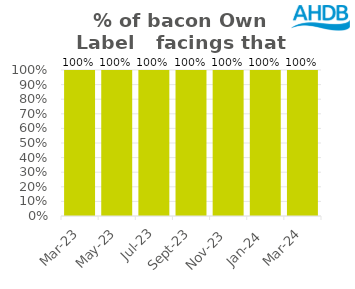
| Category | Bacon |
|---|---|
| 2023-03-01 | 1 |
| 2023-05-01 | 1 |
| 2023-07-01 | 1 |
| 2023-09-01 | 1 |
| 2023-11-01 | 1 |
| 2024-01-01 | 1 |
| 2024-03-01 | 1 |